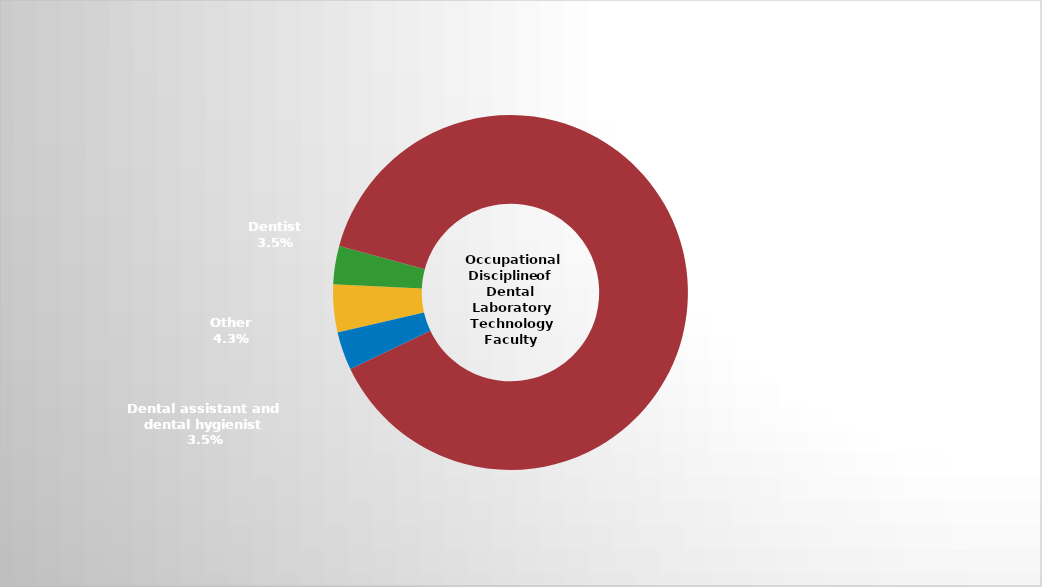
| Category | Series 2 |
|---|---|
| Other | 0.043 |
| Dentist | 0.035 |
| Dental laboratory technician | 0.887 |
| Dental assistant and dental hygienist | 0.035 |